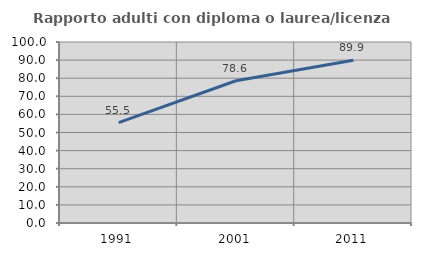
| Category | Rapporto adulti con diploma o laurea/licenza media  |
|---|---|
| 1991.0 | 55.476 |
| 2001.0 | 78.6 |
| 2011.0 | 89.922 |